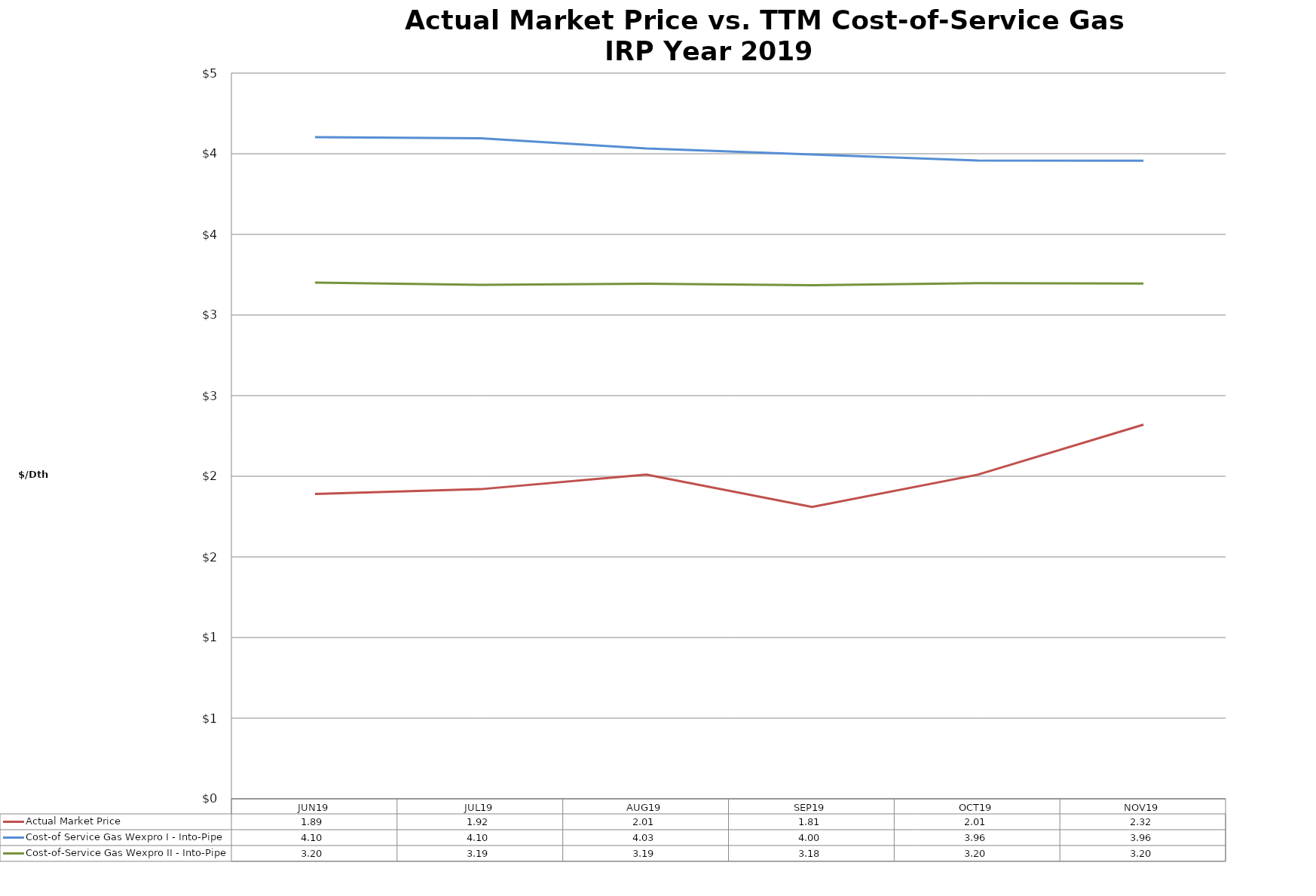
| Category | Actual Market Price | Cost-of Service Gas Wexpro I - Into-Pipe | Cost-of-Service Gas Wexpro II - Into-Pipe |
|---|---|---|---|
| JUN19 | 1.89 | 4.103 | 3.201 |
| JUL19 | 1.92 | 4.096 | 3.187 |
| AUG19 | 2.01 | 4.033 | 3.194 |
| SEP19 | 1.81 | 3.995 | 3.184 |
| OCT19 | 2.01 | 3.958 | 3.197 |
| NOV19 | 2.32 | 3.957 | 3.195 |